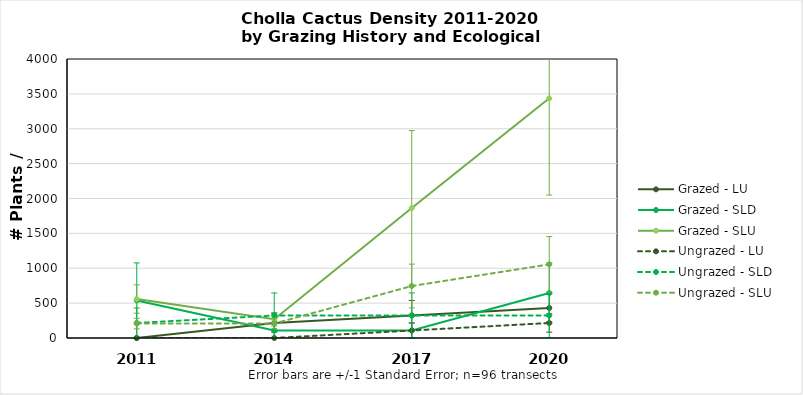
| Category | Grazed - LU | Grazed - SLD | Grazed - SLU | Ungrazed - LU | Ungrazed - SLD | Ungrazed - SLU |
|---|---|---|---|---|---|---|
| 2011.0 | 0 | 538.195 | 558.895 | 0 | 215.278 | 206.998 |
| 2014.0 | 215.278 | 107.639 | 269.098 | 0 | 322.917 | 206.998 |
| 2017.0 | 322.917 | 107.639 | 1862.983 | 107.639 | 322.917 | 745.193 |
| 2020.0 | 430.556 | 645.834 | 3436.168 | 215.278 | 322.917 | 1055.69 |